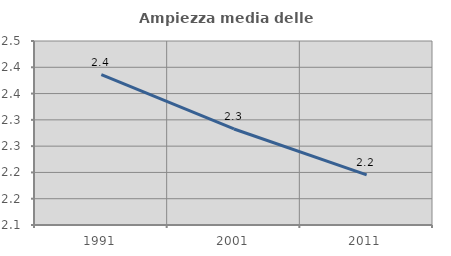
| Category | Ampiezza media delle famiglie |
|---|---|
| 1991.0 | 2.386 |
| 2001.0 | 2.283 |
| 2011.0 | 2.195 |